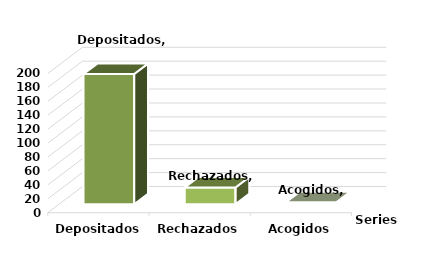
| Category | Series 0 |
|---|---|
| Depositados | 187 |
| Rechazados | 24 |
| Acogidos | 3 |